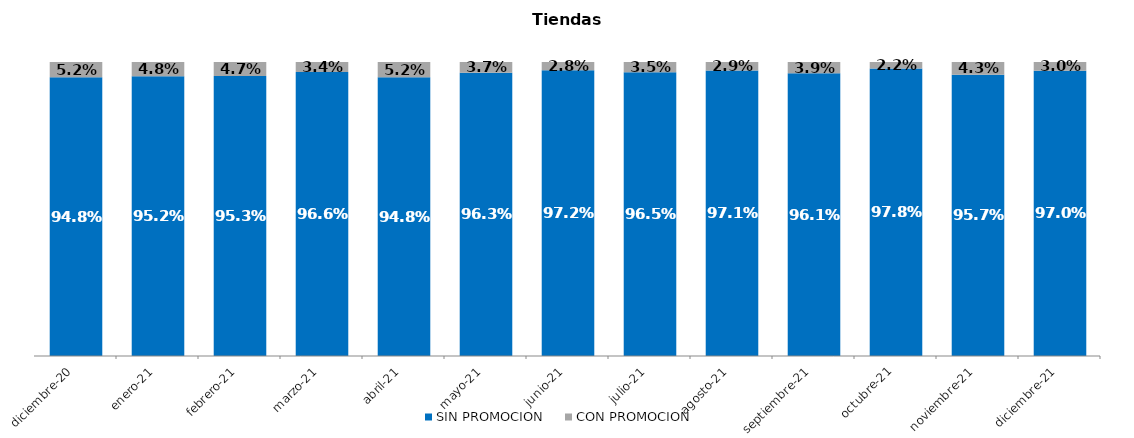
| Category | SIN PROMOCION   | CON PROMOCION   |
|---|---|---|
| 2020-12-01 | 0.948 | 0.052 |
| 2021-01-01 | 0.952 | 0.048 |
| 2021-02-01 | 0.953 | 0.047 |
| 2021-03-01 | 0.966 | 0.034 |
| 2021-04-01 | 0.948 | 0.052 |
| 2021-05-01 | 0.963 | 0.037 |
| 2021-06-01 | 0.972 | 0.028 |
| 2021-07-01 | 0.965 | 0.035 |
| 2021-08-01 | 0.971 | 0.029 |
| 2021-09-01 | 0.961 | 0.039 |
| 2021-10-01 | 0.978 | 0.022 |
| 2021-11-01 | 0.957 | 0.043 |
| 2021-12-01 | 0.97 | 0.03 |